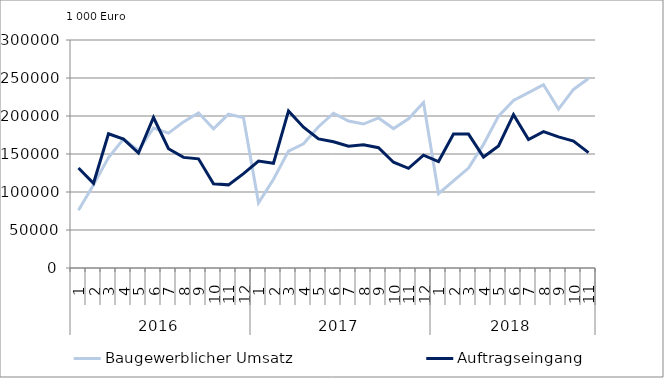
| Category | Baugewerblicher Umsatz | Auftragseingang |
|---|---|---|
| 0 | 76043.538 | 131571.482 |
| 1 | 109483.268 | 111467.248 |
| 2 | 145343.559 | 176673.268 |
| 3 | 169660.551 | 169566.96 |
| 4 | 154554.865 | 151228.165 |
| 5 | 184236.137 | 198035.655 |
| 6 | 177444.278 | 156900.898 |
| 7 | 192230.472 | 145537.167 |
| 8 | 204178.065 | 143616.217 |
| 9 | 183173.849 | 110770.94 |
| 10 | 202302.279 | 109384.188 |
| 11 | 197832.096 | 124193.91 |
| 12 | 85701.947 | 140751.008 |
| 13 | 116743.276 | 137863.383 |
| 14 | 153810.055 | 206710.579 |
| 15 | 163342.989 | 185183.797 |
| 16 | 185946.221 | 169878.51 |
| 17 | 203627.91 | 166148.392 |
| 18 | 193377.256 | 160134.206 |
| 19 | 189429.952 | 162221.206 |
| 20 | 197405.279 | 158305.285 |
| 21 | 183450.026 | 139156.761 |
| 22 | 196209.214 | 131165.419 |
| 23 | 217688.447 | 148434.901 |
| 24 | 97959.056 | 140119.385 |
| 25 | 114756.787 | 176330.213 |
| 26 | 131454.642 | 176241.061 |
| 27 | 162648.053 | 146063.407 |
| 28 | 199809.407 | 160551.931 |
| 29 | 220535.974 | 201835.846 |
| 30 | 230672.472 | 169132.23 |
| 31 | 241233.619 | 179396.293 |
| 32 | 209099.292 | 172542.764 |
| 33 | 234953.007 | 166991.729 |
| 34 | 249410.043 | 151835.629 |